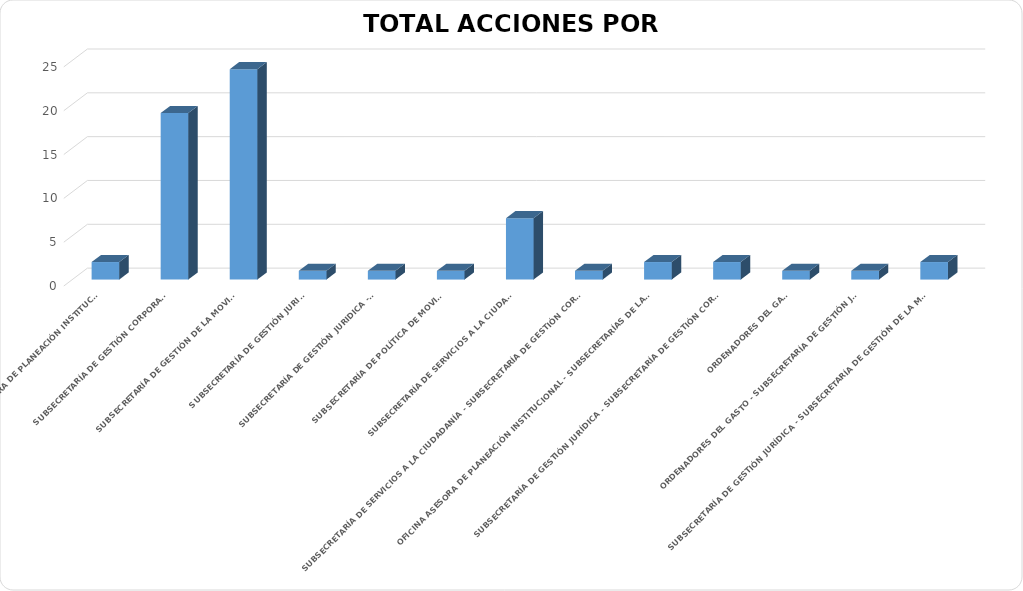
| Category | ABIERTA |
|---|---|
| OFICINA ASESORA DE PLANEACIÓN INSTITUCIONAL | 2 |
| SUBSECRETARÍA DE GESTIÓN CORPORATIVA  | 19 |
| SUBSECRETARÍA DE GESTIÓN DE LA MOVILIDAD | 24 |
| SUBSECRETARÍA DE GESTIÓN JURIDICA | 1 |
| SUBSECRETARÍA DE GESTIÓN JURIDICA - OTIC | 1 |
| SUBSECRETARÍA DE POLÍTICA DE MOVILIDAD | 1 |
| SUBSECRETARÍA DE SERVICIOS A LA CIUDADANÍA | 7 |
| SUBSECRETARÍA DE SERVICIOS A LA CIUDADANÍA - SUBSECRETARÍA DE GESTIÓN CORPORATIVA  | 1 |
| OFICINA ASESORA DE PLANEACIÓN INSTITUCIONAL - SUBSECRETARÍAS DE LA ENTIDAD. | 2 |
| SUBSECRETARÍA DE GESTIÓN JURÍDICA - SUBSECRETARÍA DE GESTIÓN CORPORATIVA | 2 |
| ORDENADORES DEL GASTO | 1 |
| ORDENADORES DEL GASTO - SUBSECRETARÍA DE GESTIÓN JURIDICA | 1 |
| SUBSECRETARÍA DE GESTIÓN JURÍDICA - SUBSECRETARÍA DE GESTIÓN DE LA MOVILIDAD | 2 |